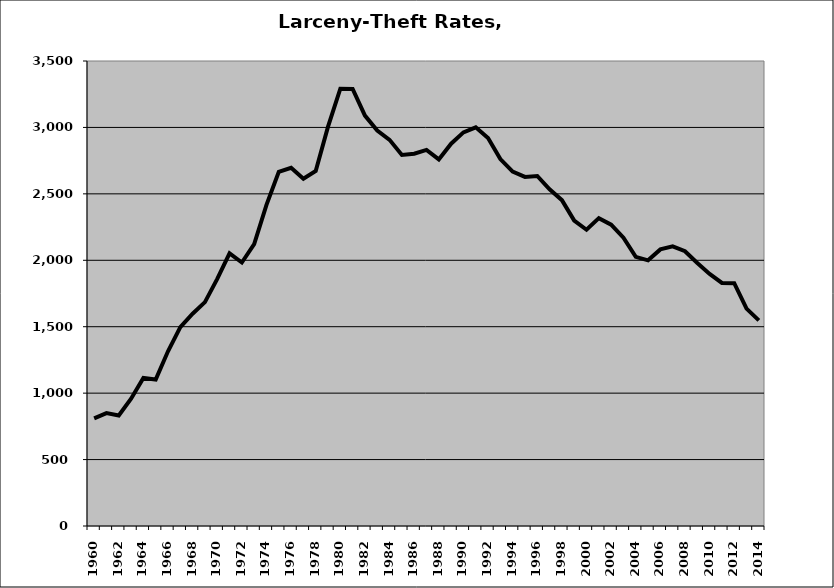
| Category | Larceny-Theft |
|---|---|
| 1960.0 | 810.648 |
| 1961.0 | 850.249 |
| 1962.0 | 831.891 |
| 1963.0 | 958.36 |
| 1964.0 | 1114.098 |
| 1965.0 | 1102.823 |
| 1966.0 | 1315.453 |
| 1967.0 | 1496.849 |
| 1968.0 | 1597.721 |
| 1969.0 | 1685.093 |
| 1970.0 | 1860.101 |
| 1971.0 | 2051.765 |
| 1972.0 | 1983.23 |
| 1973.0 | 2121.974 |
| 1974.0 | 2417.762 |
| 1975.0 | 2665.379 |
| 1976.0 | 2696.355 |
| 1977.0 | 2614.233 |
| 1978.0 | 2672.302 |
| 1979.0 | 3005.932 |
| 1980.0 | 3291.449 |
| 1981.0 | 3289.555 |
| 1982.0 | 3088.709 |
| 1983.0 | 2976.931 |
| 1984.0 | 2906.546 |
| 1985.0 | 2792.649 |
| 1986.0 | 2802.153 |
| 1987.0 | 2830.414 |
| 1988.0 | 2759.284 |
| 1989.0 | 2877.337 |
| 1990.0 | 2962.609 |
| 1991.0 | 3000.908 |
| 1992.0 | 2919.872 |
| 1993.0 | 2761.969 |
| 1994.0 | 2667.434 |
| 1995.0 | 2627.816 |
| 1996.0 | 2634.516 |
| 1997.0 | 2533.888 |
| 1998.0 | 2452.795 |
| 1999.0 | 2298.89 |
| 2000.0 | 2229.908 |
| 2001.0 | 2317.355 |
| 2002.0 | 2267.867 |
| 2003.0 | 2169.688 |
| 2004.0 | 2025.644 |
| 2005.0 | 1999.604 |
| 2006.0 | 2081.758 |
| 2007.0 | 2104.973 |
| 2008.0 | 2068.409 |
| 2009.0 | 1979.69 |
| 2010.0 | 1897.455 |
| 2011.0 | 1829.683 |
| 2012.0 | 1827.548 |
| 2013.0 | 1635.848 |
| 2014.0 | 1547.582 |